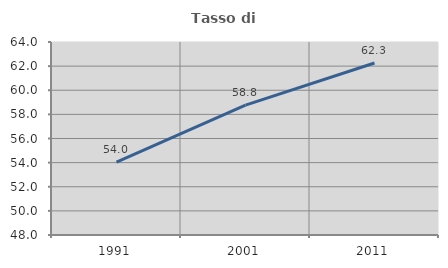
| Category | Tasso di occupazione   |
|---|---|
| 1991.0 | 54.044 |
| 2001.0 | 58.768 |
| 2011.0 | 62.259 |